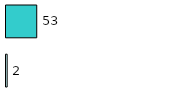
| Category | Series 0 | Series 1 |
|---|---|---|
| 0 | 2 | 53 |